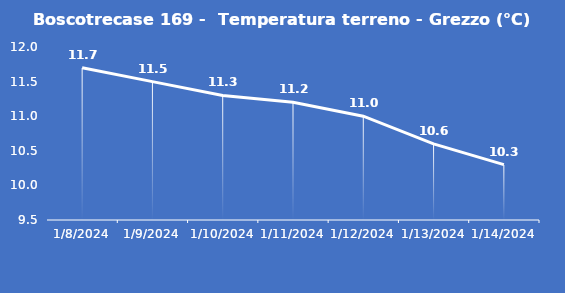
| Category | Boscotrecase 169 -  Temperatura terreno - Grezzo (°C) |
|---|---|
| 1/8/24 | 11.7 |
| 1/9/24 | 11.5 |
| 1/10/24 | 11.3 |
| 1/11/24 | 11.2 |
| 1/12/24 | 11 |
| 1/13/24 | 10.6 |
| 1/14/24 | 10.3 |